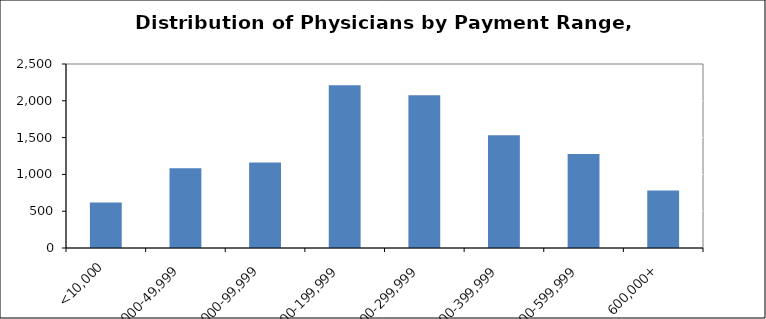
| Category | Series 0 |
|---|---|
| <10,000 | 619 |
| 10,000-49,999 | 1083 |
| 50,000-99,999 | 1162 |
| 100,000-199,999 | 2211 |
| 200,000-299,999 | 2074 |
| 300,000-399,999 | 1532 |
| 400,000-599,999 | 1276 |
| 600,000+ | 781 |